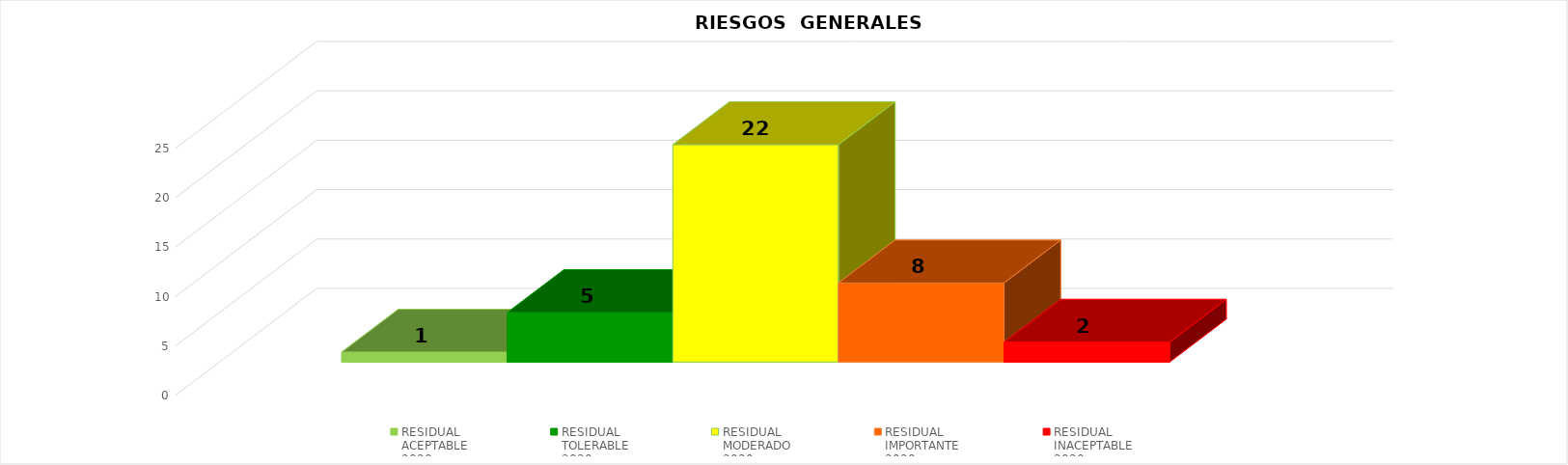
| Category | RESIDUAL
ACEPTABLE
2020 | RESIDUAL
TOLERABLE
2020 | RESIDUAL
MODERADO
2020 | RESIDUAL
IMPORTANTE
2020 | RESIDUAL
INACEPTABLE
2020 |
|---|---|---|---|---|---|
| TOTAL RIESGOS POR AÑO | 1 | 5 | 22 | 8 | 2 |